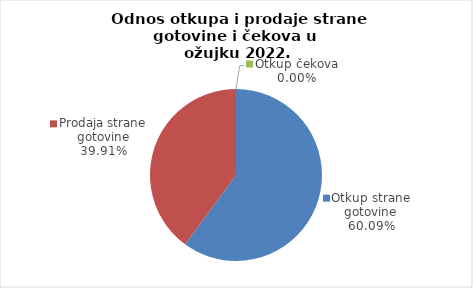
| Category | Series 0 |
|---|---|
| Otkup strane gotovine | 60.09 |
| Prodaja strane gotovine | 39.91 |
| Otkup čekova | 0 |